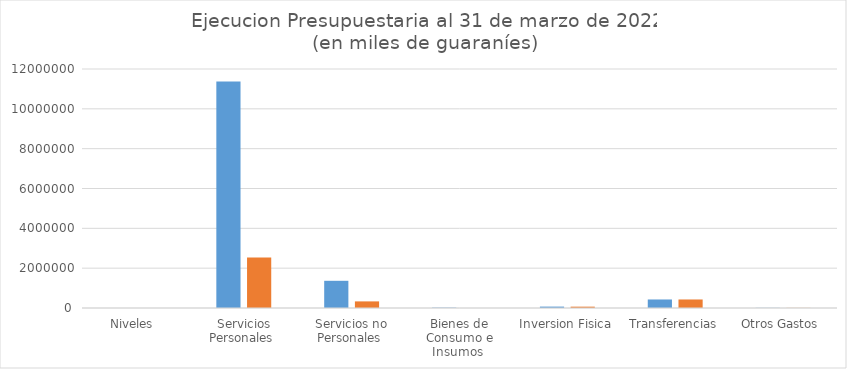
| Category | Series 0 | Series 1 |
|---|---|---|
| Niveles  | 0 | 0 |
| Servicios Personales  | 11371145.025 | 2540381.33 |
| Servicios no Personales  | 1365526.924 | 331634.527 |
| Bienes de Consumo e Insumos  | 17000 | 0 |
| Inversion Fisica | 70000 | 67161.8 |
| Transferencias | 427734.261 | 427734.261 |
| Otros Gastos  | 7890.1 | 5892.4 |